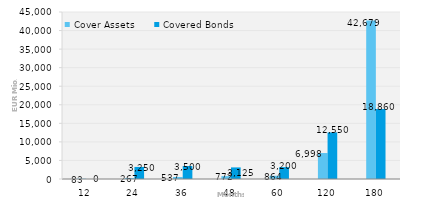
| Category | Cover Assets | Covered Bonds |
|---|---|---|
| 12.0 | 83.248 | 0 |
| 24.0 | 267.29 | 3250 |
| 36.0 | 536.536 | 3500 |
| 48.0 | 771.849 | 3125 |
| 60.0 | 863.977 | 3200 |
| 120.0 | 6998.225 | 12550 |
| 180.0 | 42679.287 | 18860 |